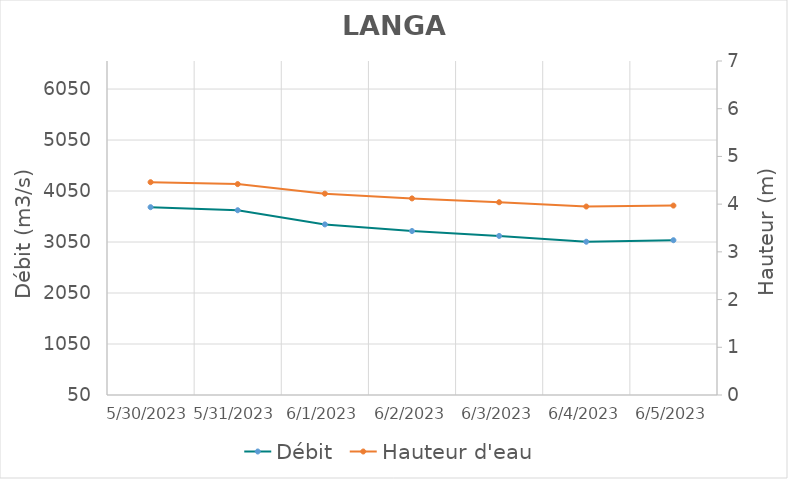
| Category | Débit |
|---|---|
| 6/29/22 | 3639.26 |
| 6/28/22 | 3705.63 |
| 6/27/22 | 4085.21 |
| 6/26/22 | 4456.17 |
| 6/25/22 | 4514.33 |
| 6/24/22 | 4638 |
| 6/23/22 | 4470.36 |